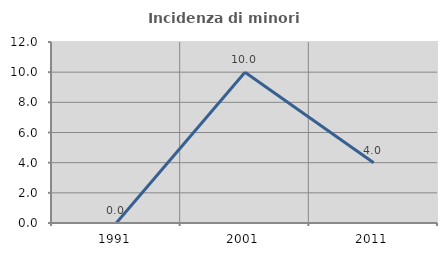
| Category | Incidenza di minori stranieri |
|---|---|
| 1991.0 | 0 |
| 2001.0 | 10 |
| 2011.0 | 4 |